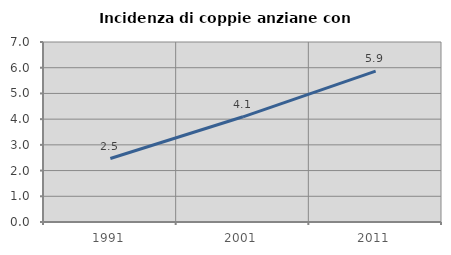
| Category | Incidenza di coppie anziane con figli |
|---|---|
| 1991.0 | 2.469 |
| 2001.0 | 4.091 |
| 2011.0 | 5.867 |